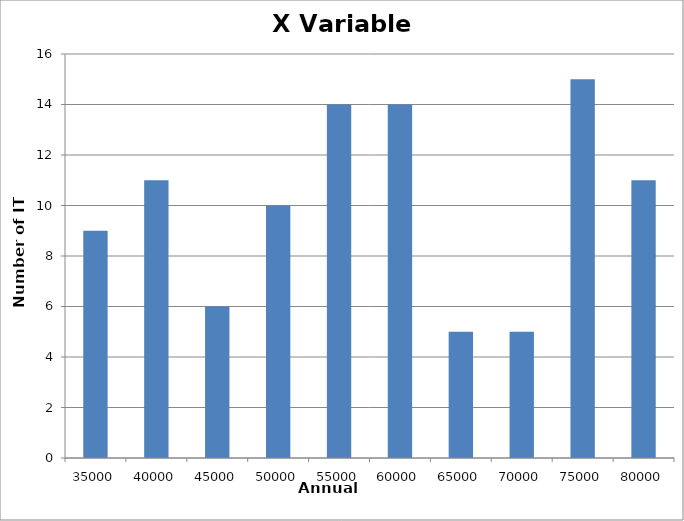
| Category | Series 0 |
|---|---|
| 35000.0 | 9 |
| 40000.0 | 11 |
| 45000.0 | 6 |
| 50000.0 | 10 |
| 55000.0 | 14 |
| 60000.0 | 14 |
| 65000.0 | 5 |
| 70000.0 | 5 |
| 75000.0 | 15 |
| 80000.0 | 11 |